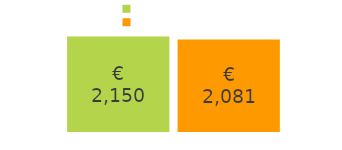
| Category | inkomsten | uitgaven |
|---|---|---|
| inkomsten: | 2150 | 2081 |